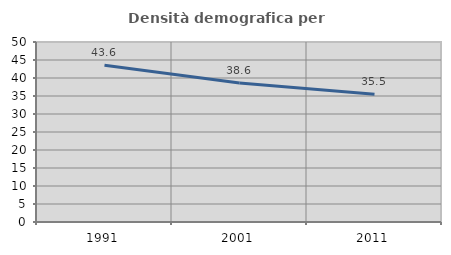
| Category | Densità demografica |
|---|---|
| 1991.0 | 43.561 |
| 2001.0 | 38.629 |
| 2011.0 | 35.462 |